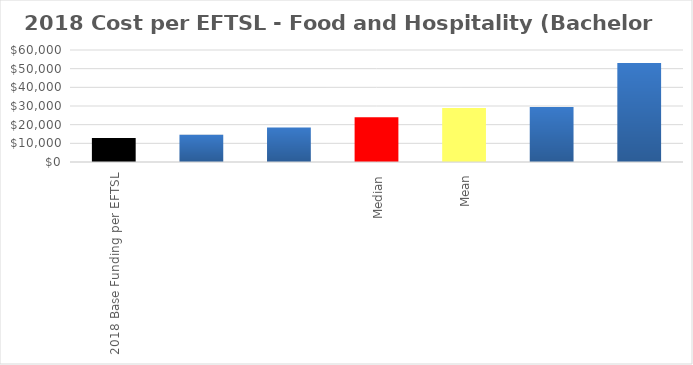
| Category | Series 0 |
|---|---|
| 2018 Base Funding per EFTSL | 12874 |
|  | 14562.905 |
|  | 18489.364 |
| Median | 24008.026 |
| Mean | 28907.643 |